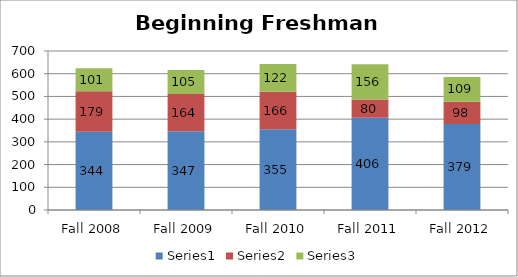
| Category | Series 0 | Series 1 | Series 2 |
|---|---|---|---|
| Fall 2008 | 344 | 179 | 101 |
| Fall 2009 | 347 | 164 | 105 |
| Fall 2010 | 355 | 166 | 122 |
| Fall 2011 | 406 | 80 | 156 |
| Fall 2012 | 379 | 98 | 109 |